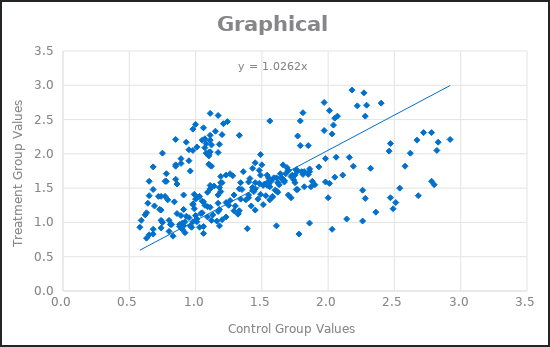
| Category | Series 0 |
|---|---|
| 0.58 | 0.93 |
| 0.59 | 1.03 |
| 0.63 | 1.14 |
| 0.69 | 1.24 |
| 0.79 | 1.33 |
| 0.91 | 1.4 |
| 0.99 | 1.41 |
| 1.0 | 1.34 |
| 1.06 | 1.3 |
| 0.63 | 0.77 |
| 0.65 | 0.82 |
| 0.68 | 0.9 |
| 0.75 | 1 |
| 0.86 | 1.13 |
| 0.98 | 1.26 |
| 1.05 | 1.31 |
| 1.07 | 1.25 |
| 1.11 | 1.22 |
| 0.68 | 0.83 |
| 0.74 | 0.92 |
| 0.8 | 1.03 |
| 0.91 | 1.19 |
| 1.02 | 1.37 |
| 1.14 | 1.53 |
| 1.2 | 1.58 |
| 1.18 | 1.51 |
| 1.17 | 1.4 |
| 0.65 | 1.39 |
| 0.65 | 1.6 |
| 0.68 | 1.81 |
| 0.75 | 2.01 |
| 0.85 | 2.21 |
| 0.98 | 2.36 |
| 1.06 | 2.38 |
| 1.07 | 2.22 |
| 1.1 | 1.97 |
| 0.62 | 1.11 |
| 0.64 | 1.28 |
| 0.68 | 1.48 |
| 0.78 | 1.71 |
| 0.89 | 1.93 |
| 1.01 | 2.1 |
| 1.08 | 2.15 |
| 1.08 | 2.01 |
| 1.12 | 1.82 |
| 0.72 | 1.38 |
| 0.77 | 1.6 |
| 0.85 | 1.82 |
| 0.98 | 2.05 |
| 1.11 | 2.27 |
| 1.21 | 2.44 |
| 1.24 | 2.47 |
| 1.2 | 2.28 |
| 1.17 | 2.02 |
| 1.45 | 1.18 |
| 1.72 | 1.36 |
| 2.01 | 1.57 |
| 2.32 | 1.79 |
| 2.62 | 2.01 |
| 2.83 | 2.17 |
| 2.92 | 2.21 |
| 2.82 | 2.05 |
| 2.58 | 1.82 |
| 1.2 | 1.04 |
| 1.29 | 1.17 |
| 1.38 | 1.33 |
| 1.43 | 1.51 |
| 1.49 | 1.69 |
| 1.5 | 1.84 |
| 1.45 | 1.87 |
| 1.36 | 1.74 |
| 1.34 | 1.58 |
| 0.91 | 0.95 |
| 0.95 | 1.07 |
| 0.99 | 1.2 |
| 1.03 | 1.38 |
| 1.11 | 1.54 |
| 1.19 | 1.67 |
| 1.23 | 1.69 |
| 1.19 | 1.58 |
| 1.19 | 1.45 |
| 0.96 | 1.75 |
| 1.11 | 2.03 |
| 1.33 | 2.27 |
| 1.56 | 2.48 |
| 1.81 | 2.6 |
| 2.01 | 2.63 |
| 2.07 | 2.55 |
| 1.97 | 2.34 |
| 1.79 | 2.12 |
| 0.82 | 0.97 |
| 0.93 | 1.09 |
| 1.09 | 1.23 |
| 1.29 | 1.4 |
| 1.52 | 1.56 |
| 1.75 | 1.69 |
| 1.85 | 1.7 |
| 1.75 | 1.58 |
| 1.6 | 1.47 |
| 0.97 | 0.93 |
| 1.12 | 1.03 |
| 1.33 | 1.17 |
| 1.56 | 1.33 |
| 1.82 | 1.52 |
| 2.05 | 1.66 |
| 2.11 | 1.69 |
| 1.98 | 1.59 |
| 1.76 | 1.48 |
| 0.98 | 1.01 |
| 1.13 | 1.11 |
| 1.3 | 1.24 |
| 1.49 | 1.41 |
| 1.67 | 1.59 |
| 1.82 | 1.74 |
| 1.86 | 1.78 |
| 1.72 | 1.67 |
| 1.55 | 1.56 |
| 0.88 | 0.94 |
| 1.01 | 1.05 |
| 1.18 | 1.19 |
| 1.4 | 1.36 |
| 1.63 | 1.55 |
| 1.81 | 1.7 |
| 1.86 | 1.74 |
| 1.74 | 1.62 |
| 1.56 | 1.52 |
| 0.8 | 0.87 |
| 0.88 | 0.97 |
| 1.0 | 1.1 |
| 1.17 | 1.28 |
| 1.35 | 1.48 |
| 1.55 | 1.65 |
| 1.64 | 1.71 |
| 1.57 | 1.6 |
| 1.45 | 1.49 |
| 1.58 | 1.37 |
| 1.88 | 1.6 |
| 2.19 | 1.82 |
| 2.46 | 2.04 |
| 2.67 | 2.2 |
| 2.78 | 2.31 |
| 2.72 | 2.31 |
| 2.47 | 2.15 |
| 2.16 | 1.95 |
| 1.09 | 1.44 |
| 1.26 | 1.71 |
| 1.49 | 1.99 |
| 1.77 | 2.26 |
| 2.05 | 2.52 |
| 2.29 | 2.71 |
| 2.4 | 2.74 |
| 2.28 | 2.55 |
| 2.03 | 2.29 |
| 1.48 | 1.57 |
| 1.66 | 1.84 |
| 1.85 | 2.12 |
| 2.04 | 2.42 |
| 2.22 | 2.7 |
| 2.27 | 2.89 |
| 2.18 | 2.93 |
| 1.97 | 2.75 |
| 1.79 | 2.48 |
| 1.39 | 0.91 |
| 1.61 | 0.95 |
| 1.86 | 0.99 |
| 2.14 | 1.05 |
| 2.36 | 1.15 |
| 2.51 | 1.29 |
| 2.47 | 1.36 |
| 2.28 | 1.35 |
| 2.0 | 1.36 |
| 1.03 | 0.93 |
| 1.16 | 1.02 |
| 1.32 | 1.13 |
| 1.51 | 1.26 |
| 1.7 | 1.4 |
| 1.87 | 1.52 |
| 1.9 | 1.55 |
| 1.77 | 1.48 |
| 1.61 | 1.46 |
| 0.73 | 1.19 |
| 0.74 | 1.38 |
| 0.78 | 1.6 |
| 0.85 | 1.84 |
| 0.95 | 2.06 |
| 1.05 | 2.2 |
| 1.11 | 2.2 |
| 1.1 | 2.02 |
| 1.11 | 1.83 |
| 0.74 | 1.03 |
| 0.74 | 1.18 |
| 0.77 | 1.38 |
| 0.85 | 1.63 |
| 0.95 | 1.9 |
| 1.07 | 2.09 |
| 1.12 | 2.13 |
| 1.1 | 1.99 |
| 1.1 | 1.85 |
| 0.92 | 1.01 |
| 1.04 | 1.13 |
| 1.23 | 1.29 |
| 1.43 | 1.47 |
| 1.61 | 1.65 |
| 1.76 | 1.76 |
| 1.77 | 1.75 |
| 1.65 | 1.63 |
| 1.54 | 1.58 |
| 0.9 | 0.9 |
| 1.01 | 1.01 |
| 1.17 | 1.16 |
| 1.34 | 1.34 |
| 1.54 | 1.54 |
| 1.68 | 1.71 |
| 1.7 | 1.76 |
| 1.59 | 1.65 |
| 1.45 | 1.58 |
| 0.9 | 0.99 |
| 1.05 | 1.14 |
| 1.26 | 1.32 |
| 1.51 | 1.54 |
| 1.76 | 1.77 |
| 1.98 | 1.93 |
| 2.06 | 1.95 |
| 1.93 | 1.81 |
| 1.73 | 1.69 |
| 1.78 | 0.83 |
| 2.03 | 0.9 |
| 2.26 | 1.02 |
| 2.49 | 1.2 |
| 2.68 | 1.39 |
| 2.8 | 1.55 |
| 2.78 | 1.6 |
| 2.54 | 1.5 |
| 2.26 | 1.47 |
| 1.06 | 0.84 |
| 1.18 | 0.95 |
| 1.32 | 1.12 |
| 1.47 | 1.34 |
| 1.62 | 1.58 |
| 1.7 | 1.76 |
| 1.69 | 1.8 |
| 1.54 | 1.69 |
| 1.41 | 1.64 |
| 0.81 | 0.97 |
| 0.89 | 1.1 |
| 0.98 | 1.27 |
| 1.11 | 1.49 |
| 1.28 | 1.68 |
| 1.43 | 1.79 |
| 1.48 | 1.76 |
| 1.4 | 1.59 |
| 1.33 | 1.49 |
| 0.83 | 0.8 |
| 0.92 | 0.85 |
| 1.06 | 0.94 |
| 1.23 | 1.08 |
| 1.42 | 1.24 |
| 1.58 | 1.38 |
| 1.62 | 1.44 |
| 1.53 | 1.39 |
| 1.4 | 1.4 |
| 0.96 | 0.95 |
| 1.09 | 1.08 |
| 1.25 | 1.25 |
| 1.44 | 1.45 |
| 1.65 | 1.65 |
| 1.8 | 1.74 |
| 1.81 | 1.72 |
| 1.67 | 1.61 |
| 1.54 | 1.56 |
| 0.84 | 1.3 |
| 0.86 | 1.56 |
| 0.89 | 1.86 |
| 0.93 | 2.17 |
| 1.0 | 2.43 |
| 1.11 | 2.59 |
| 1.17 | 2.56 |
| 1.15 | 2.33 |
| 1.18 | 2.14 |